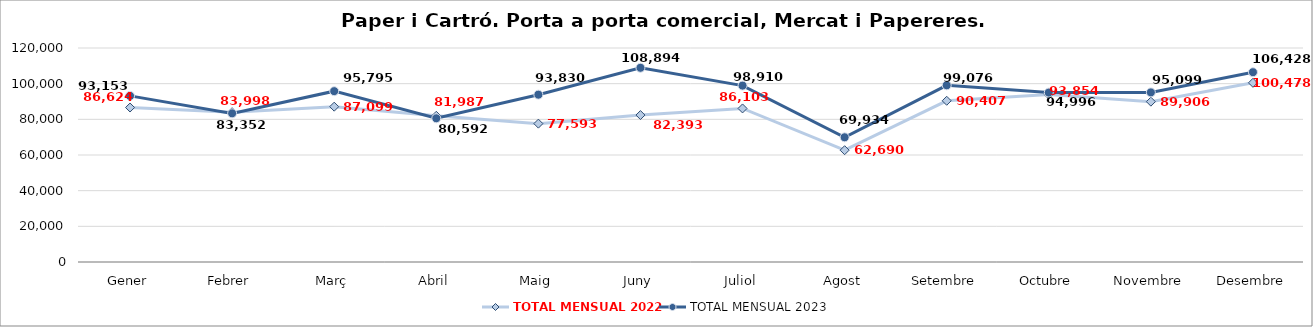
| Category | TOTAL MENSUAL 2022 | TOTAL MENSUAL 2023 |
|---|---|---|
| Gener | 86623.8 | 93153.3 |
| Febrer | 83997.6 | 83351.5 |
| Març | 87099.2 | 95795.2 |
| Abril | 81987.391 | 80591.8 |
| Maig | 77592.6 | 93830.4 |
| Juny | 82393.2 | 108893.5 |
| Juliol | 86102.8 | 98909.7 |
| Agost | 62690.27 | 69934.1 |
| Setembre | 90406.5 | 99075.6 |
| Octubre | 93854.1 | 94996.2 |
| Novembre | 89906.35 | 95099 |
| Desembre | 100477.7 | 106428 |